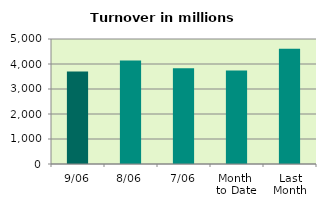
| Category | Series 0 |
|---|---|
| 9/06 | 3703.391 |
| 8/06 | 4141.746 |
| 7/06 | 3833.768 |
| Month 
to Date | 3737.929 |
| Last
Month | 4609.327 |